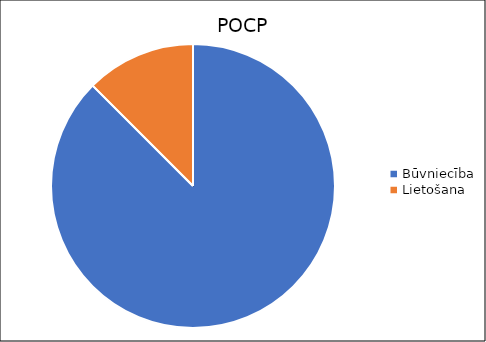
| Category | Series 0 |
|---|---|
| Būvniecība | 0.028 |
| Lietošana | 0.004 |